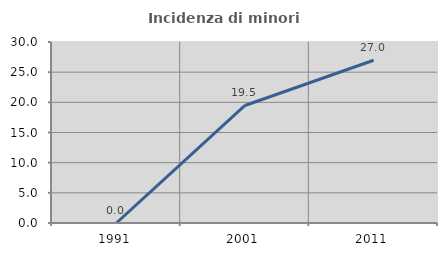
| Category | Incidenza di minori stranieri |
|---|---|
| 1991.0 | 0 |
| 2001.0 | 19.481 |
| 2011.0 | 26.974 |